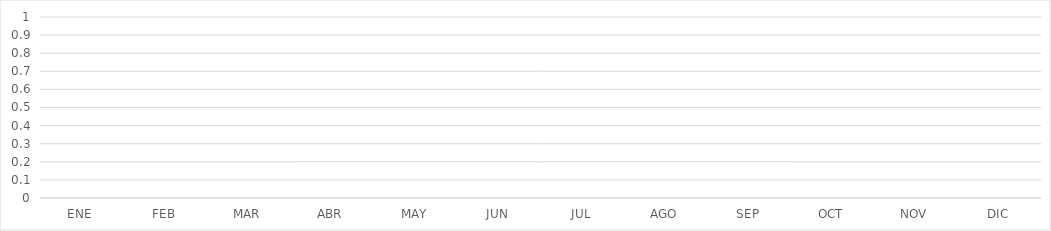
| Category | Series 0 |
|---|---|
| ENE | 0 |
| FEB | 0 |
| MAR | 0 |
| ABR | 0 |
| MAY | 0 |
| JUN | 0 |
| JUL | 0 |
| AGO | 0 |
| SEP | 0 |
| OCT | 0 |
| NOV | 0 |
| DIC | 0 |